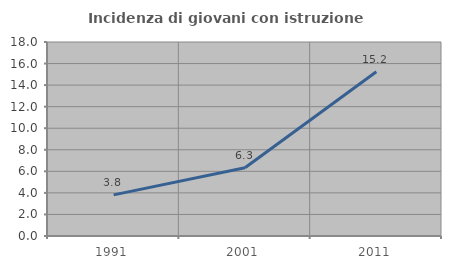
| Category | Incidenza di giovani con istruzione universitaria |
|---|---|
| 1991.0 | 3.817 |
| 2001.0 | 6.329 |
| 2011.0 | 15.244 |